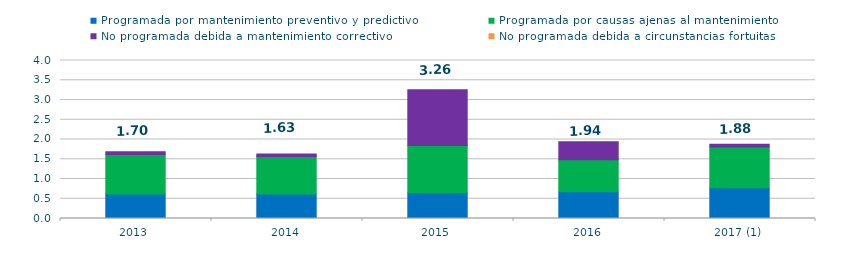
| Category | Programada por mantenimiento preventivo y predictivo | Programada por causas ajenas al mantenimiento  | No programada debida a mantenimiento correctivo  | No programada debida a circunstancias fortuitas  |
|---|---|---|---|---|
| 2013 | 0.62 | 1 | 0.07 | 0 |
| 2014 | 0.62 | 0.95 | 0.06 | 0 |
| 2015 | 0.65 | 1.2 | 1.41 | 0 |
| 2016 | 0.68 | 0.81 | 0.45 | 0 |
| 2017 (1) | 0.78 | 1.03 | 0.07 | 0 |